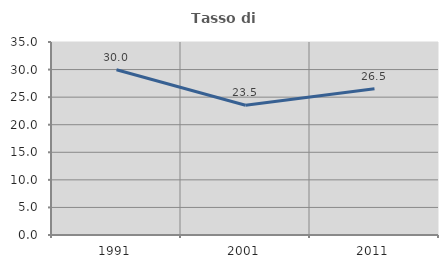
| Category | Tasso di occupazione   |
|---|---|
| 1991.0 | 29.964 |
| 2001.0 | 23.529 |
| 2011.0 | 26.542 |